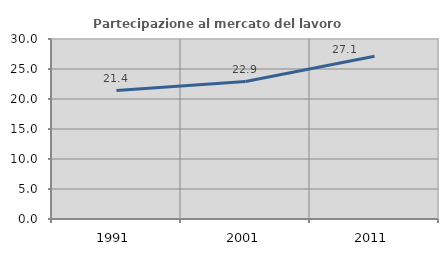
| Category | Partecipazione al mercato del lavoro  femminile |
|---|---|
| 1991.0 | 21.402 |
| 2001.0 | 22.907 |
| 2011.0 | 27.119 |